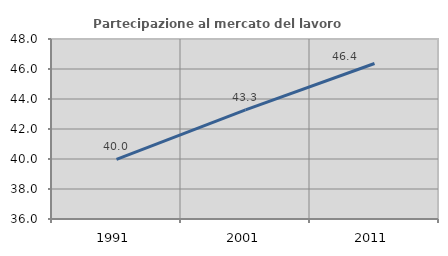
| Category | Partecipazione al mercato del lavoro  femminile |
|---|---|
| 1991.0 | 39.978 |
| 2001.0 | 43.275 |
| 2011.0 | 46.369 |